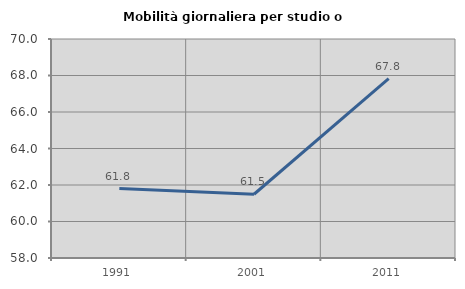
| Category | Mobilità giornaliera per studio o lavoro |
|---|---|
| 1991.0 | 61.806 |
| 2001.0 | 61.493 |
| 2011.0 | 67.835 |